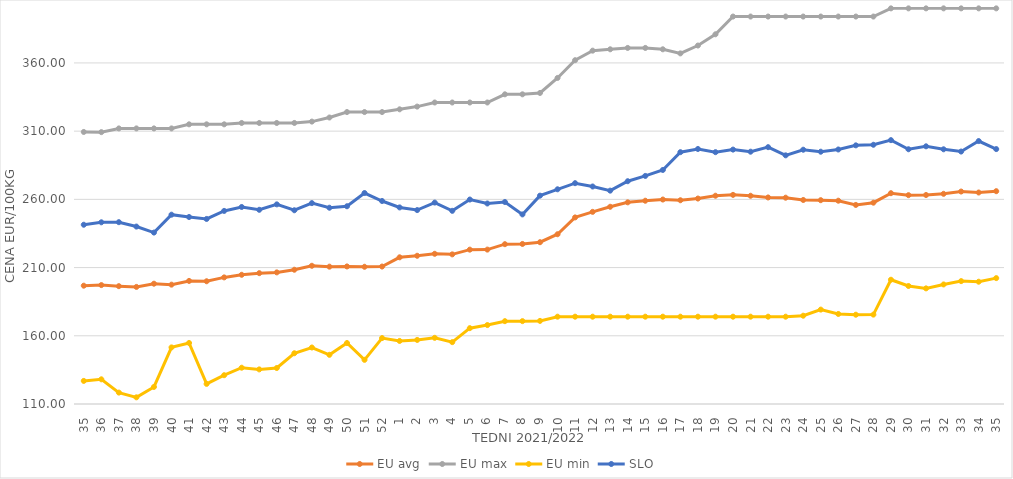
| Category | EU avg | EU max | EU min | SLO |
|---|---|---|---|---|
| 35.0 | 196.72 | 309.41 | 126.926 | 241.39 |
| 36.0 | 197.157 | 309.28 | 128.099 | 243.19 |
| 37.0 | 196.375 | 312 | 118.364 | 243.28 |
| 38.0 | 195.821 | 312 | 114.892 | 240.06 |
| 39.0 | 198.179 | 312 | 122.517 | 235.66 |
| 40.0 | 197.482 | 312 | 151.488 | 248.77 |
| 41.0 | 200.22 | 315 | 154.74 | 247.07 |
| 42.0 | 199.965 | 315 | 124.748 | 245.64 |
| 43.0 | 202.804 | 315 | 131.104 | 251.53 |
| 44.0 | 204.713 | 316 | 136.6 | 254.42 |
| 45.0 | 205.906 | 316 | 135.362 | 252.35 |
| 46.0 | 206.476 | 316 | 136.39 | 256.33 |
| 47.0 | 208.415 | 316 | 147.192 | 252.01 |
| 48.0 | 211.314 | 317 | 151.41 | 257.25 |
| 49.0 | 210.677 | 320 | 146.064 | 253.87 |
| 50.0 | 210.823 | 324 | 154.698 | 254.94 |
| 51.0 | 210.59 | 324 | 142.382 | 264.65 |
| 52.0 | 210.763 | 324 | 158.333 | 258.8 |
| 1.0 | 217.519 | 326 | 156.222 | 254.09 |
| 2.0 | 218.654 | 328 | 156.969 | 252.15 |
| 3.0 | 220.098 | 331 | 158.511 | 257.65 |
| 4.0 | 219.685 | 331 | 155.346 | 251.6 |
| 5.0 | 223.143 | 331 | 165.59 | 259.87 |
| 6.0 | 223.178 | 331 | 167.86 | 256.97 |
| 7.0 | 227.145 | 337 | 170.719 | 258.07 |
| 8.0 | 227.312 | 337 | 170.743 | 248.97 |
| 9.0 | 228.588 | 338 | 170.92 | 262.72 |
| 10.0 | 234.434 | 349 | 174 | 267.38 |
| 11.0 | 246.762 | 362 | 174 | 271.86 |
| 12.0 | 250.845 | 369 | 174 | 269.43 |
| 13.0 | 254.568 | 370 | 174 | 266.39 |
| 14.0 | 257.819 | 371 | 174 | 273.3 |
| 15.0 | 259 | 371 | 174 | 277.18 |
| 16.0 | 259.873 | 370 | 174 | 281.55 |
| 17.0 | 259.351 | 367 | 174 | 294.59 |
| 18.0 | 260.6 | 372.758 | 174 | 296.93 |
| 19.0 | 262.669 | 381 | 174 | 294.6 |
| 20.0 | 263.291 | 394 | 174 | 296.48 |
| 21.0 | 262.64 | 394 | 174 | 294.94 |
| 22.0 | 261.388 | 394 | 174 | 298.26 |
| 23.0 | 261.228 | 394 | 174 | 292.27 |
| 24.0 | 259.544 | 394 | 174.72 | 296.39 |
| 25.0 | 259.395 | 394 | 179.2 | 294.93 |
| 26.0 | 259.018 | 394 | 176 | 296.56 |
| 27.0 | 255.922 | 394 | 175.451 | 299.59 |
| 28.0 | 257.569 | 394 | 175.52 | 300.01 |
| 29.0 | 264.525 | 400 | 201.097 | 303.41 |
| 30.0 | 263.072 | 400 | 196.496 | 296.73 |
| 31.0 | 263.201 | 400 | 194.756 | 298.88 |
| 32.0 | 264.064 | 400 | 197.634 | 296.7 |
| 33.0 | 265.734 | 400 | 200.07 | 295.05 |
| 34.0 | 265.021 | 400 | 199.637 | 302.73 |
| 35.0 | 265.988 | 400 | 202.277 | 296.86 |